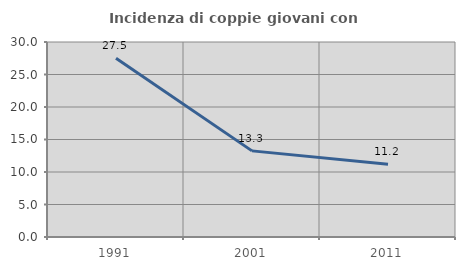
| Category | Incidenza di coppie giovani con figli |
|---|---|
| 1991.0 | 27.517 |
| 2001.0 | 13.25 |
| 2011.0 | 11.2 |